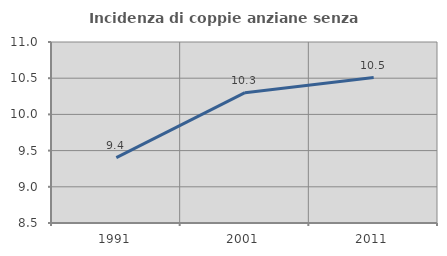
| Category | Incidenza di coppie anziane senza figli  |
|---|---|
| 1991.0 | 9.404 |
| 2001.0 | 10.3 |
| 2011.0 | 10.509 |